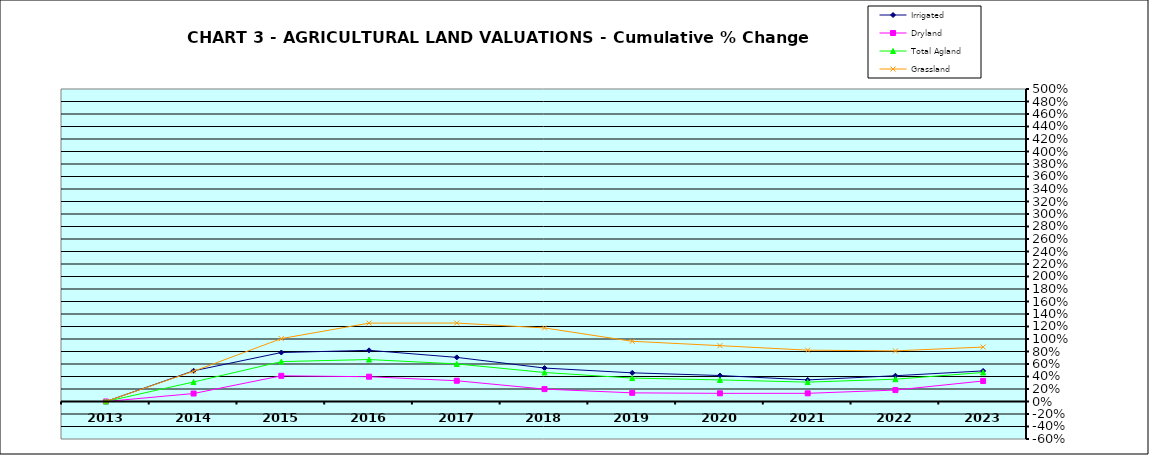
| Category | Irrigated | Dryland | Total Agland | Grassland |
|---|---|---|---|---|
| 2013.0 | 0 | 0 | 0 | 0 |
| 2014.0 | 0.491 | 0.128 | 0.312 | 0.484 |
| 2015.0 | 0.784 | 0.411 | 0.638 | 1.006 |
| 2016.0 | 0.819 | 0.397 | 0.672 | 1.254 |
| 2017.0 | 0.706 | 0.332 | 0.601 | 1.255 |
| 2018.0 | 0.535 | 0.198 | 0.464 | 1.177 |
| 2019.0 | 0.459 | 0.138 | 0.375 | 0.963 |
| 2020.0 | 0.416 | 0.131 | 0.346 | 0.894 |
| 2021.0 | 0.345 | 0.131 | 0.31 | 0.821 |
| 2022.0 | 0.412 | 0.183 | 0.357 | 0.81 |
| 2023.0 | 0.49 | 0.329 | 0.464 | 0.871 |